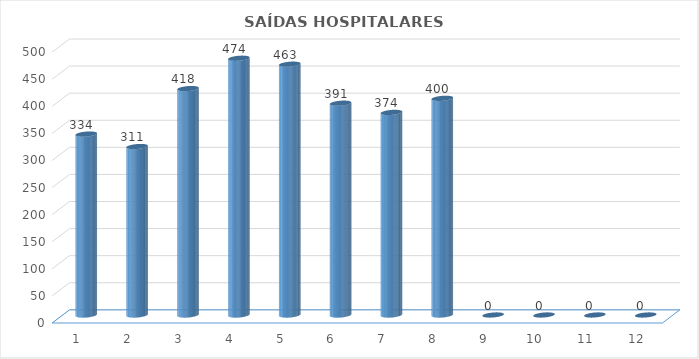
| Category | Series 0 |
|---|---|
| 0 | 334 |
| 1 | 311 |
| 2 | 418 |
| 3 | 474 |
| 4 | 463 |
| 5 | 391 |
| 6 | 374 |
| 7 | 400 |
| 8 | 0 |
| 9 | 0 |
| 10 | 0 |
| 11 | 0 |